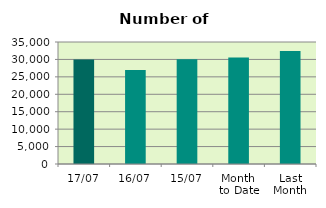
| Category | Series 0 |
|---|---|
| 17/07 | 29966 |
| 16/07 | 26982 |
| 15/07 | 30054 |
| Month 
to Date | 30533.692 |
| Last
Month | 32421.5 |